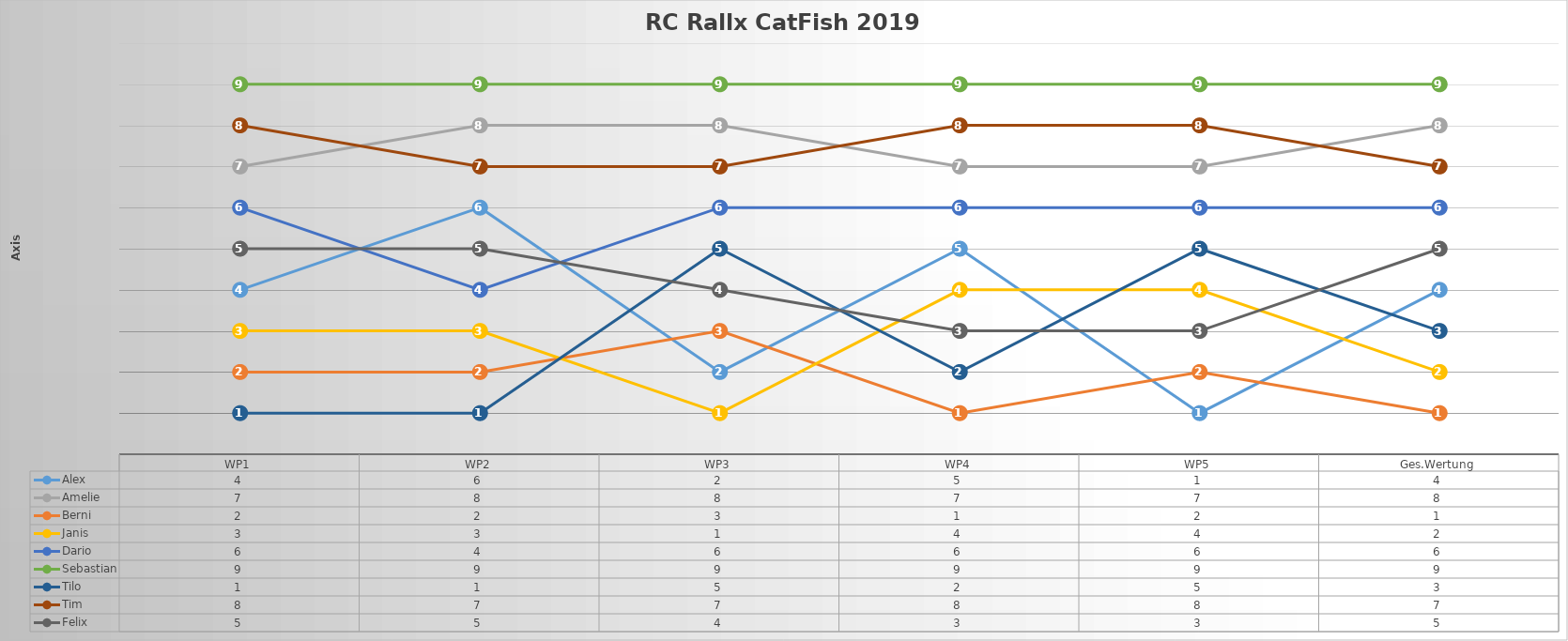
| Category | Alex | Amelie | Berni | Janis | Dario | Sebastian | Tilo | Tim | Felix |
|---|---|---|---|---|---|---|---|---|---|
| WP1 | 4 | 7 | 2 | 3 | 6 | 9 | 1 | 8 | 5 |
| WP2 | 6 | 8 | 2 | 3 | 4 | 9 | 1 | 7 | 5 |
| WP3 | 2 | 8 | 3 | 1 | 6 | 9 | 5 | 7 | 4 |
| WP4 | 5 | 7 | 1 | 4 | 6 | 9 | 2 | 8 | 3 |
| WP5 | 1 | 7 | 2 | 4 | 6 | 9 | 5 | 8 | 3 |
| Ges.Wertung | 4 | 8 | 1 | 2 | 6 | 9 | 3 | 7 | 5 |